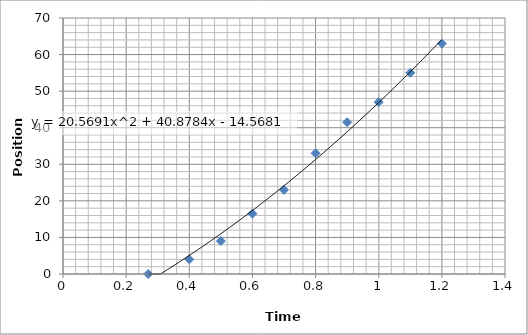
| Category | Series 0 |
|---|---|
| 0.27 | 0 |
| 0.4 | 4 |
| 0.5 | 9 |
| 0.6 | 16.5 |
| 0.7 | 23 |
| 0.8 | 33 |
| 0.9 | 41.5 |
| 1.0 | 47 |
| 1.1 | 55 |
| 1.2 | 63 |